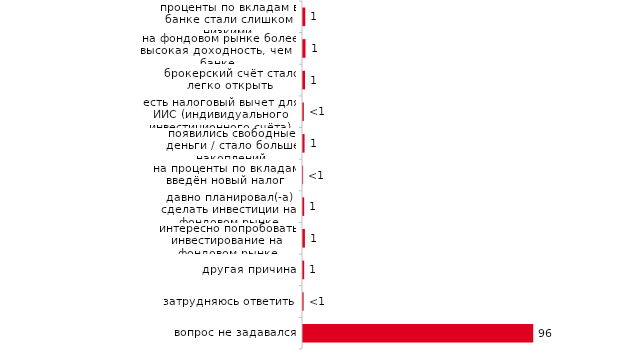
| Category | Series 0 |
|---|---|
| проценты по вкладам в банке стали слишком низкими | 0.95 |
| на фондовом рынке более высокая доходность, чем в банке | 1.05 |
| брокерский счёт стало легко открыть | 0.85 |
| есть налоговый вычет для ИИС (индивидуального инвестиционного счёта) | 0.35 |
| появились свободные деньги / стало больше накоплений | 0.65 |
| на проценты по вкладам введён новый налог | 0.05 |
| давно планировал(-а) сделать инвестиции на фондовом рынке | 0.5 |
| интересно попробовать инвестирование на фондовом рынке | 0.8 |
| другая причина | 0.5 |
| затрудняюсь ответить | 0.25 |
| вопрос не задавался | 96.25 |